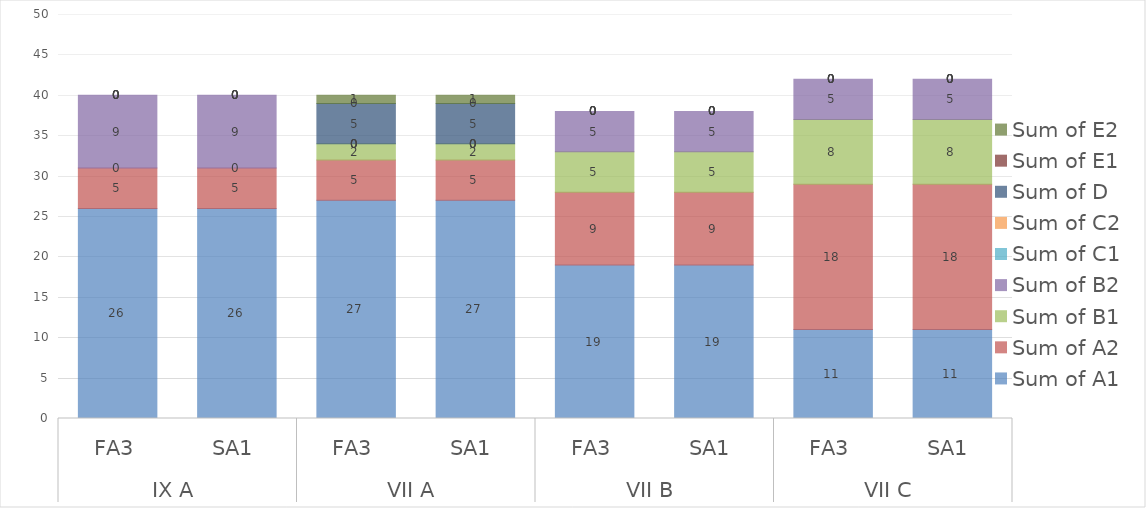
| Category | Sum of A1 | Sum of A2 | Sum of B1 | Sum of B2 | Sum of C1 | Sum of C2 | Sum of D | Sum of E1 | Sum of E2 |
|---|---|---|---|---|---|---|---|---|---|
| 0 | 26 | 5 | 0 | 9 | 0 | 0 | 0 | 0 | 0 |
| 1 | 26 | 5 | 0 | 9 | 0 | 0 | 0 | 0 | 0 |
| 2 | 27 | 5 | 2 | 0 | 0 | 0 | 5 | 0 | 1 |
| 3 | 27 | 5 | 2 | 0 | 0 | 0 | 5 | 0 | 1 |
| 4 | 19 | 9 | 5 | 5 | 0 | 0 | 0 | 0 | 0 |
| 5 | 19 | 9 | 5 | 5 | 0 | 0 | 0 | 0 | 0 |
| 6 | 11 | 18 | 8 | 5 | 0 | 0 | 0 | 0 | 0 |
| 7 | 11 | 18 | 8 | 5 | 0 | 0 | 0 | 0 | 0 |